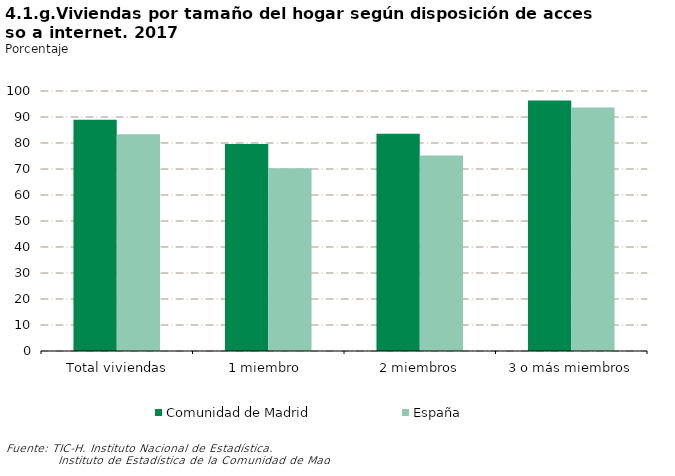
| Category | Comunidad de Madrid | España |
|---|---|---|
| Total viviendas | 88.918 | 83.386 |
| 1 miembro  | 79.642 | 70.271 |
| 2 miembros | 83.59 | 75.206 |
| 3 o más miembros | 96.316 | 93.608 |